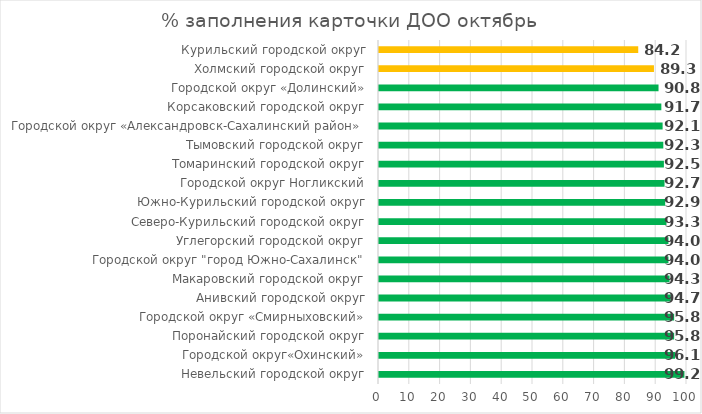
| Category | Series 0 |
|---|---|
| Невельский городской округ | 99.167 |
| Городской округ«Охинский» | 96.111 |
| Поронайский городской округ | 95.833 |
| Городской округ «Смирныховский» | 95.833 |
| Анивский городской округ | 94.722 |
| Макаровский городской округ | 94.333 |
| Городской округ "город Южно-Сахалинск" | 93.981 |
| Углегорский городской округ | 93.974 |
| Северо-Курильский городской округ | 93.333 |
| Южно-Курильский городской округ | 92.917 |
| Городской округ Ногликский | 92.708 |
| Томаринский городской округ | 92.5 |
| Тымовский городской округ | 92.308 |
| Городской округ «Александровск-Сахалинский район»  | 92.083 |
| Корсаковский городской округ | 91.667 |
| Городской округ «Долинский» | 90.758 |
| Холмский городской округ | 89.271 |
| Курильский городской округ | 84.167 |